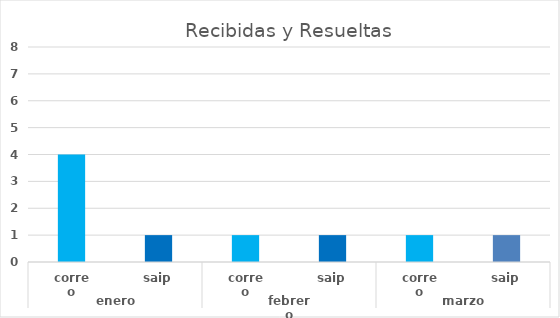
| Category | Recibidas |
|---|---|
| 0 | 4 |
| 1 | 1 |
| 2 | 1 |
| 3 | 1 |
| 4 | 1 |
| 5 | 1 |